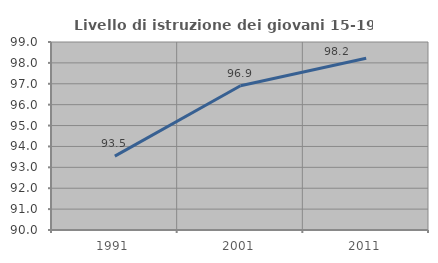
| Category | Livello di istruzione dei giovani 15-19 anni |
|---|---|
| 1991.0 | 93.538 |
| 2001.0 | 96.905 |
| 2011.0 | 98.224 |